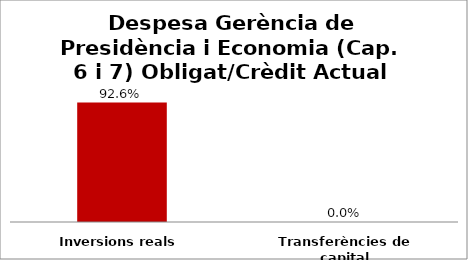
| Category | Series 0 |
|---|---|
| Inversions reals | 0.926 |
| Transferències de capital | 0 |